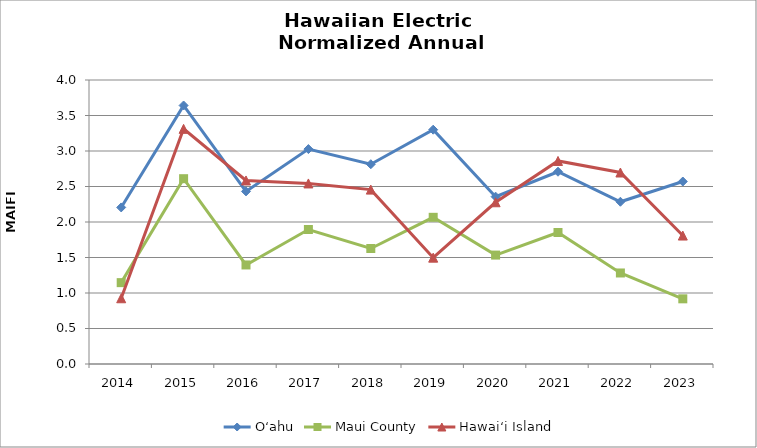
| Category | O‘ahu | Maui County | Hawai‘i Island |
|---|---|---|---|
| 2014.0 | 2.205 | 1.146 | 0.926 |
| 2015.0 | 3.641 | 2.61 | 3.312 |
| 2016.0 | 2.431 | 1.395 | 2.585 |
| 2017.0 | 3.027 | 1.894 | 2.543 |
| 2018.0 | 2.814 | 1.627 | 2.456 |
| 2019.0 | 3.3 | 2.066 | 1.498 |
| 2020.0 | 2.357 | 1.534 | 2.278 |
| 2021.0 | 2.708 | 1.852 | 2.86 |
| 2022.0 | 2.285 | 1.282 | 2.697 |
| 2023.0 | 2.57 | 0.918 | 1.809 |